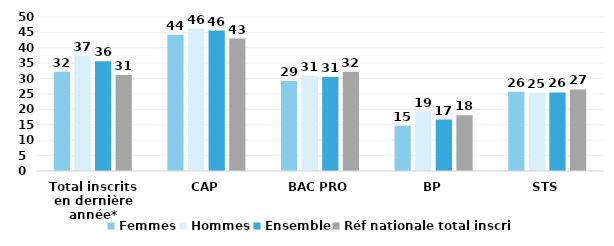
| Category | Femmes | Hommes | Ensemble | Réf nationale total inscrits |
|---|---|---|---|---|
| Total inscrits en dernière année* | 32.2 | 37.3 | 35.6 | 31.2 |
| CAP | 44.2 | 46.2 | 45.6 | 43 |
| BAC PRO | 29.2 | 30.9 | 30.5 | 32.2 |
| BP | 14.7 | 19.2 | 16.7 | 18.1 |
| STS | 25.7 | 25.4 | 25.5 | 26.5 |